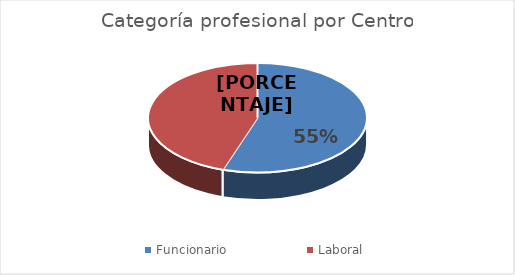
| Category | Series 0 |
|---|---|
| Funcionario | 86 |
| Laboral | 70 |